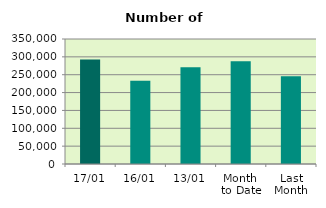
| Category | Series 0 |
|---|---|
| 17/01 | 292610 |
| 16/01 | 233352 |
| 13/01 | 270816 |
| Month 
to Date | 288027 |
| Last
Month | 245553.619 |